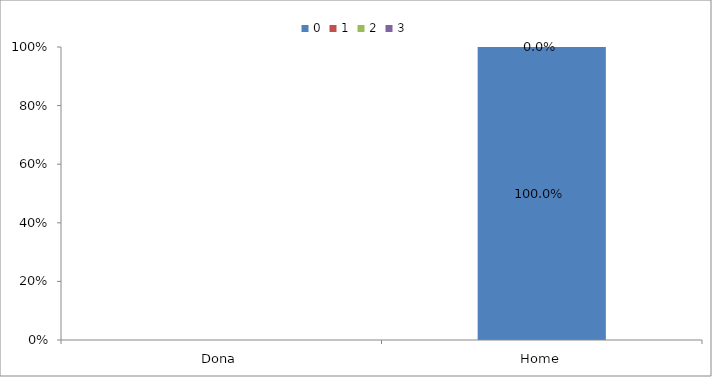
| Category | 0 | 1 | 2 | 3 |
|---|---|---|---|---|
| Dona | 0 | 0 | 0 | 0 |
| Home | 1 | 0 | 0 | 0 |